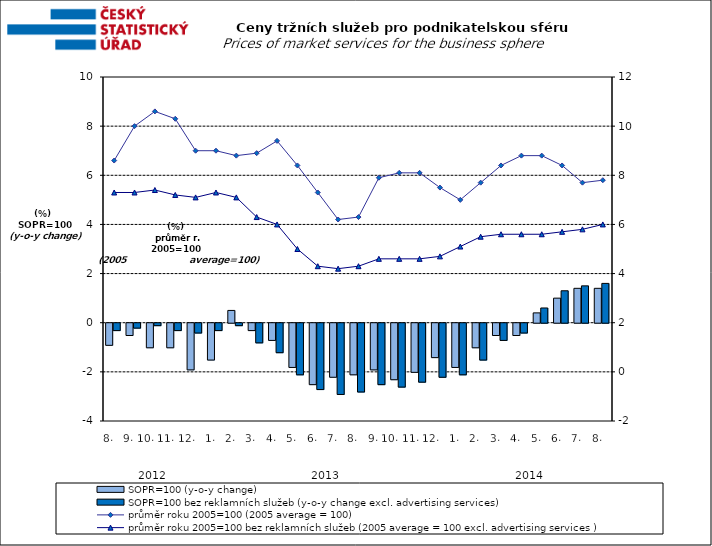
| Category | SOPR=100 (y-o-y change)   | SOPR=100 bez reklamních služeb (y-o-y change excl. advertising services)   |
|---|---|---|
| 0 | -0.9 | -0.3 |
| 1 | -0.5 | -0.2 |
| 2 | -1 | -0.1 |
| 3 | -1 | -0.3 |
| 4 | -1.9 | -0.4 |
| 5 | -1.5 | -0.3 |
| 6 | 0.5 | -0.1 |
| 7 | -0.3 | -0.8 |
| 8 | -0.7 | -1.2 |
| 9 | -1.8 | -2.1 |
| 10 | -2.5 | -2.7 |
| 11 | -2.2 | -2.9 |
| 12 | -2.1 | -2.8 |
| 13 | -1.9 | -2.5 |
| 14 | -2.3 | -2.6 |
| 15 | -2 | -2.4 |
| 16 | -1.4 | -2.2 |
| 17 | -1.8 | -2.1 |
| 18 | -1 | -1.5 |
| 19 | -0.5 | -0.7 |
| 20 | -0.5 | -0.4 |
| 21 | 0.4 | 0.6 |
| 22 | 1 | 1.3 |
| 23 | 1.4 | 1.5 |
| 24 | 1.4 | 1.6 |